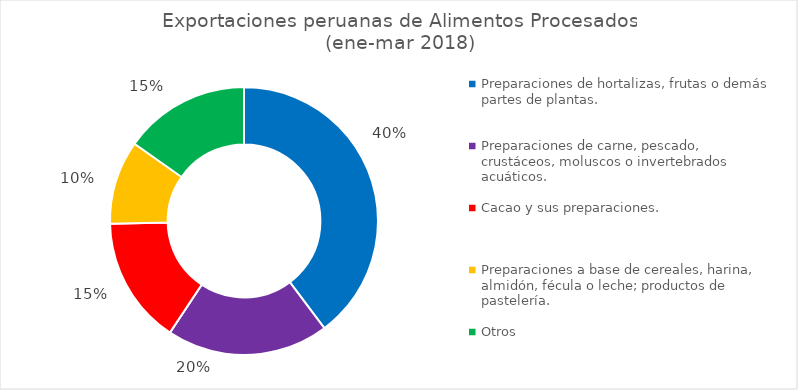
| Category | Series 0 |
|---|---|
| Preparaciones de hortalizas, frutas o demás partes de plantas. | 0.398 |
| Preparaciones de carne, pescado, crustáceos, moluscos o invertebrados acuáticos. | 0.196 |
| Cacao y sus preparaciones. | 0.154 |
| Preparaciones a base de cereales, harina, almidón, fécula o leche; productos de pastelería. | 0.101 |
| Otros | 0.152 |